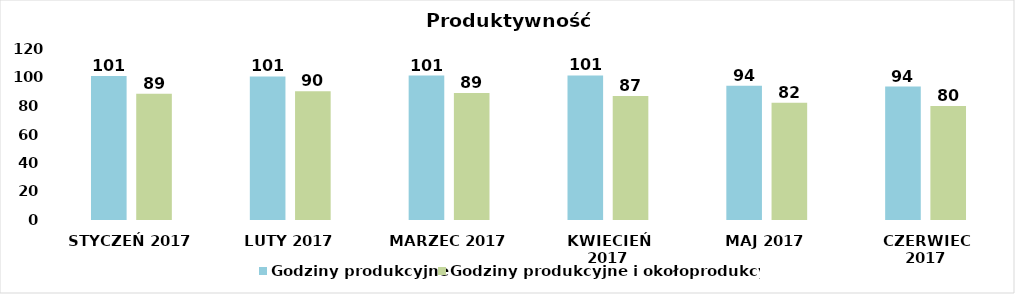
| Category | Godziny produkcyjne | Godziny produkcyjne i okołoprodukcyjne |
|---|---|---|
| STYCZEŃ 2017 | 101.131 | 88.592 |
| LUTY 2017 | 100.75 | 90.436 |
| MARZEC 2017 | 101.377 | 89.126 |
| KWIECIEŃ 2017 | 101.486 | 87.076 |
| MAJ 2017 | 94.186 | 82.29 |
| CZERWIEC 2017 | 93.6 | 79.936 |